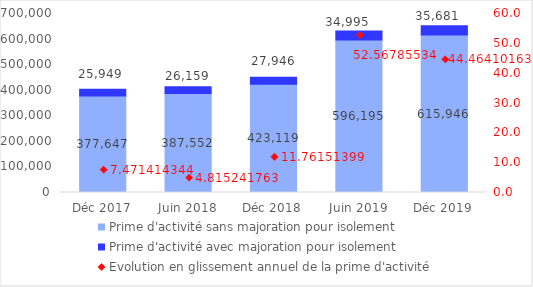
| Category | Prime d'activité sans majoration pour isolement | Prime d'activité avec majoration pour isolement |
|---|---|---|
| Déc 2017 | 377647 | 25949 |
| Juin 2018 | 387552 | 26159 |
| Déc 2018 | 423119 | 27946 |
| Juin 2019 | 596195 | 34995 |
| Déc 2019 | 615946 | 35681 |